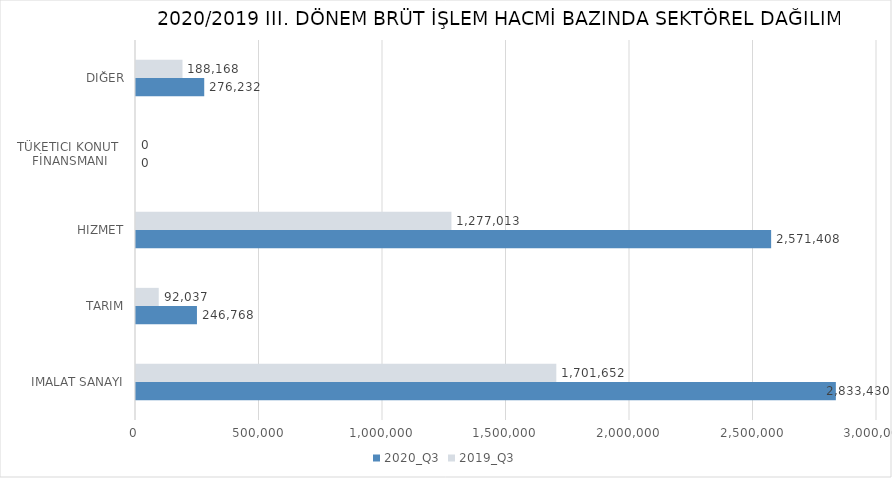
| Category | 2020_Q3 | 2019_Q3 |
|---|---|---|
| İMALAT SANAYİ | 2833430.156 | 1701651.876 |
| TARIM | 246767.964 | 92036.645 |
| HİZMET | 2571407.774 | 1277013.446 |
| TÜKETİCİ KONUT 
FİNANSMANI | 0 | 0 |
| DİĞER | 276232 | 188168.4 |